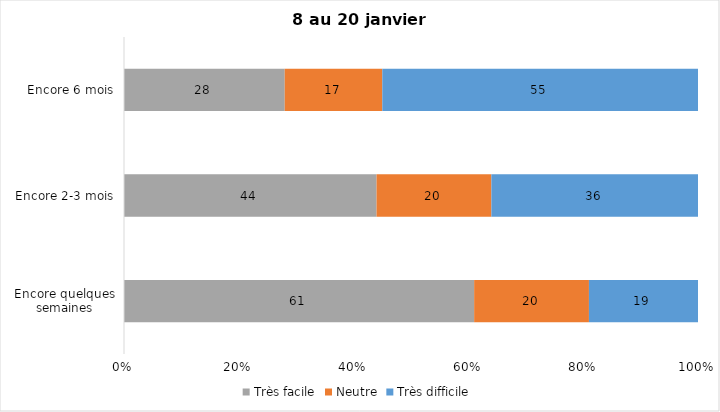
| Category | Très facile | Neutre | Très difficile |
|---|---|---|---|
| Encore quelques semaines | 61 | 20 | 19 |
| Encore 2-3 mois | 44 | 20 | 36 |
| Encore 6 mois | 28 | 17 | 55 |